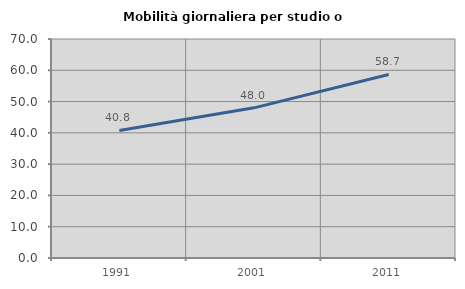
| Category | Mobilità giornaliera per studio o lavoro |
|---|---|
| 1991.0 | 40.754 |
| 2001.0 | 47.993 |
| 2011.0 | 58.672 |